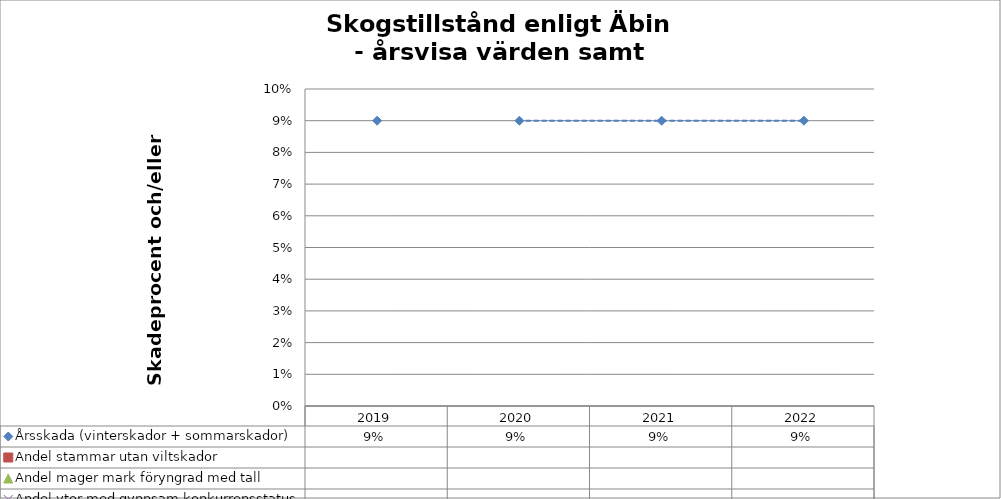
| Category | Årsskada (vinterskador + sommarskador) |
|---|---|
| 2019.0 | 0.09 |
| 2020.0 | 0.09 |
| 2021.0 | 0.09 |
| 2022.0 | 0.09 |